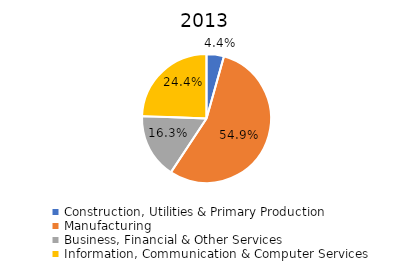
| Category | 2013 |
|---|---|
| Construction, Utilities & Primary Production  | 0.044 |
| Manufacturing  | 0.549 |
| Business, Financial & Other Services | 0.163 |
| Information, Communication & Computer Services | 0.244 |